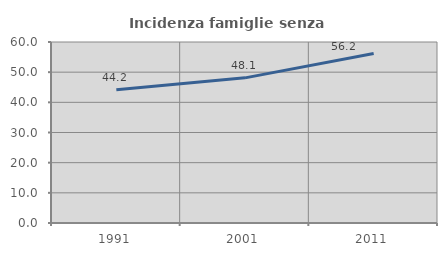
| Category | Incidenza famiglie senza nuclei |
|---|---|
| 1991.0 | 44.211 |
| 2001.0 | 48.113 |
| 2011.0 | 56.195 |